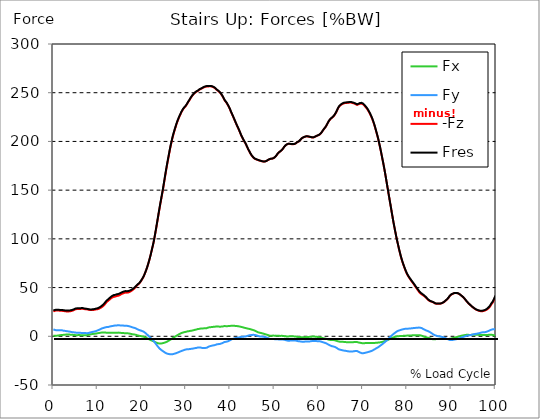
| Category |  Fx |  Fy |  -Fz |  Fres |
|---|---|---|---|---|
| 0.0 | 0.705 | 7.108 | 25.486 | 26.561 |
| 0.167348456675344 | 0.621 | 6.804 | 25.816 | 26.795 |
| 0.334696913350688 | 0.553 | 6.524 | 26.119 | 27.015 |
| 0.5020453700260321 | 0.542 | 6.317 | 26.335 | 27.174 |
| 0.669393826701376 | 0.573 | 6.162 | 26.482 | 27.281 |
| 0.83674228337672 | 0.639 | 6.08 | 26.582 | 27.365 |
| 1.0040907400520642 | 0.742 | 6.082 | 26.562 | 27.353 |
| 1.1621420602454444 | 0.868 | 6.098 | 26.439 | 27.243 |
| 1.3294905169207885 | 1.006 | 6.14 | 26.299 | 27.123 |
| 1.4968389735961325 | 1.133 | 6.156 | 26.194 | 27.028 |
| 1.6641874302714765 | 1.225 | 6.145 | 26.158 | 27.001 |
| 1.8315358869468206 | 1.305 | 6.141 | 26.12 | 26.974 |
| 1.9988843436221646 | 1.37 | 6.098 | 26.083 | 26.94 |
| 2.1662328002975086 | 1.422 | 5.884 | 26.077 | 26.892 |
| 2.333581256972853 | 1.484 | 5.678 | 26.022 | 26.81 |
| 2.5009297136481967 | 1.608 | 5.677 | 25.781 | 26.625 |
| 2.6682781703235405 | 1.688 | 5.535 | 25.633 | 26.49 |
| 2.8356266269988843 | 1.742 | 5.316 | 25.541 | 26.382 |
| 3.002975083674229 | 1.771 | 5.221 | 25.507 | 26.364 |
| 3.1703235403495724 | 1.788 | 5.142 | 25.497 | 26.374 |
| 3.337671997024917 | 1.791 | 5.036 | 25.489 | 26.389 |
| 3.4957233172182973 | 1.777 | 4.952 | 25.53 | 26.446 |
| 3.663071773893641 | 1.725 | 4.779 | 25.594 | 26.524 |
| 3.8304202305689854 | 1.678 | 4.625 | 25.704 | 26.636 |
| 3.997768687244329 | 1.634 | 4.481 | 25.842 | 26.767 |
| 4.165117143919673 | 1.567 | 4.31 | 26.033 | 26.928 |
| 4.332465600595017 | 1.506 | 4.184 | 26.307 | 27.175 |
| 4.499814057270361 | 1.445 | 4.095 | 26.599 | 27.465 |
| 4.667162513945706 | 1.361 | 4.031 | 26.943 | 27.797 |
| 4.834510970621049 | 1.261 | 4.006 | 27.346 | 28.166 |
| 5.001859427296393 | 1.181 | 3.823 | 27.71 | 28.462 |
| 5.169207883971737 | 1.143 | 3.648 | 27.905 | 28.611 |
| 5.336556340647081 | 1.14 | 3.556 | 28 | 28.697 |
| 5.503904797322425 | 1.164 | 3.492 | 28.042 | 28.736 |
| 5.671253253997769 | 1.218 | 3.536 | 28.025 | 28.756 |
| 5.82930457419115 | 1.262 | 3.657 | 27.936 | 28.728 |
| 5.996653030866494 | 1.225 | 3.608 | 27.966 | 28.762 |
| 6.164001487541838 | 1.12 | 3.491 | 28.135 | 28.886 |
| 6.331349944217181 | 1.085 | 3.403 | 28.22 | 28.936 |
| 6.498698400892526 | 1.081 | 3.33 | 28.238 | 28.928 |
| 6.66604685756787 | 1.068 | 3.255 | 28.234 | 28.903 |
| 6.833395314243213 | 1.092 | 3.282 | 28.103 | 28.775 |
| 7.000743770918558 | 1.101 | 3.351 | 27.894 | 28.576 |
| 7.168092227593902 | 1.144 | 3.384 | 27.757 | 28.418 |
| 7.335440684269246 | 1.131 | 3.27 | 27.725 | 28.328 |
| 7.50278914094459 | 1.114 | 3.134 | 27.702 | 28.249 |
| 7.6701375976199335 | 1.218 | 3.18 | 27.573 | 28.106 |
| 7.837486054295278 | 1.349 | 3.271 | 27.419 | 27.949 |
| 7.995537374488658 | 1.518 | 3.421 | 27.226 | 27.766 |
| 8.162885831164003 | 1.741 | 3.706 | 27.055 | 27.605 |
| 8.330234287839346 | 1.922 | 3.916 | 26.971 | 27.545 |
| 8.49758274451469 | 2.072 | 4.104 | 26.966 | 27.568 |
| 8.664931201190035 | 2.209 | 4.296 | 26.982 | 27.605 |
| 8.832279657865378 | 2.334 | 4.474 | 27.007 | 27.655 |
| 8.999628114540721 | 2.441 | 4.633 | 27.051 | 27.733 |
| 9.166976571216066 | 2.57 | 4.846 | 27.126 | 27.847 |
| 9.334325027891412 | 2.647 | 4.992 | 27.25 | 28.006 |
| 9.501673484566755 | 2.731 | 5.178 | 27.419 | 28.214 |
| 9.669021941242098 | 2.817 | 5.374 | 27.62 | 28.452 |
| 9.836370397917442 | 2.961 | 5.688 | 27.716 | 28.614 |
| 10.003718854592787 | 3.132 | 6.035 | 27.77 | 28.727 |
| 10.17106731126813 | 3.229 | 6.293 | 28.043 | 29.05 |
| 10.329118631461512 | 3.362 | 6.622 | 28.345 | 29.419 |
| 10.496467088136853 | 3.504 | 6.983 | 28.708 | 29.86 |
| 10.663815544812199 | 3.642 | 7.359 | 29.126 | 30.365 |
| 10.831164001487544 | 3.765 | 7.76 | 29.59 | 30.926 |
| 10.998512458162887 | 3.871 | 8.134 | 30.078 | 31.5 |
| 11.16586091483823 | 3.899 | 8.44 | 30.596 | 32.068 |
| 11.333209371513574 | 3.834 | 8.536 | 31.319 | 32.775 |
| 11.50055782818892 | 3.828 | 8.766 | 32.128 | 33.619 |
| 11.667906284864264 | 3.84 | 9.07 | 33.02 | 34.562 |
| 11.835254741539607 | 3.782 | 9.275 | 34.008 | 35.562 |
| 12.00260319821495 | 3.706 | 9.407 | 34.891 | 36.44 |
| 12.169951654890292 | 3.593 | 9.345 | 35.527 | 37.035 |
| 12.337300111565641 | 3.57 | 9.458 | 36.249 | 37.76 |
| 12.504648568240984 | 3.561 | 9.634 | 36.896 | 38.421 |
| 12.662699888434362 | 3.649 | 9.901 | 37.497 | 39.076 |
| 12.830048345109708 | 3.695 | 10.092 | 38.134 | 39.747 |
| 12.997396801785053 | 3.727 | 10.274 | 38.803 | 40.444 |
| 13.164745258460396 | 3.742 | 10.451 | 39.379 | 41.036 |
| 13.33209371513574 | 3.707 | 10.56 | 39.872 | 41.538 |
| 13.499442171811083 | 3.676 | 10.672 | 40.355 | 42.03 |
| 13.666790628486426 | 3.706 | 10.807 | 40.567 | 42.274 |
| 13.834139085161771 | 3.719 | 10.956 | 40.655 | 42.406 |
| 14.001487541837117 | 3.725 | 11.151 | 40.742 | 42.554 |
| 14.16883599851246 | 3.696 | 11.14 | 41.029 | 42.815 |
| 14.336184455187803 | 3.704 | 11.167 | 41.333 | 43.103 |
| 14.503532911863147 | 3.741 | 11.233 | 41.492 | 43.268 |
| 14.670881368538492 | 3.766 | 11.284 | 41.617 | 43.398 |
| 14.828932688731873 | 3.736 | 11.28 | 41.849 | 43.612 |
| 14.996281145407215 | 3.639 | 11.196 | 42.248 | 43.965 |
| 15.163629602082558 | 3.534 | 11.117 | 42.732 | 44.405 |
| 15.330978058757903 | 3.438 | 11.057 | 43.223 | 44.855 |
| 15.498326515433247 | 3.418 | 11.064 | 43.575 | 45.196 |
| 15.665674972108594 | 3.379 | 11.024 | 43.872 | 45.492 |
| 15.833023428783937 | 3.256 | 10.89 | 44.227 | 45.819 |
| 16.00037188545928 | 3.229 | 10.901 | 44.474 | 46.064 |
| 16.167720342134626 | 3.178 | 10.856 | 44.78 | 46.343 |
| 16.335068798809967 | 3.136 | 10.777 | 44.867 | 46.398 |
| 16.502417255485312 | 3.177 | 10.824 | 44.717 | 46.27 |
| 16.669765712160658 | 3.119 | 10.73 | 44.774 | 46.294 |
| 16.837114168836 | 3.049 | 10.623 | 44.854 | 46.333 |
| 17.004462625511344 | 2.947 | 10.476 | 45.051 | 46.478 |
| 17.16251394570472 | 2.807 | 10.281 | 45.384 | 46.743 |
| 17.32986240238007 | 2.66 | 10.065 | 45.755 | 47.041 |
| 17.497210859055414 | 2.482 | 9.784 | 46.204 | 47.399 |
| 17.664559315730756 | 2.304 | 9.497 | 46.693 | 47.798 |
| 17.8319077724061 | 2.132 | 9.209 | 47.245 | 48.267 |
| 17.999256229081443 | 2.021 | 8.998 | 47.758 | 48.721 |
| 18.166604685756788 | 1.923 | 8.822 | 48.373 | 49.291 |
| 18.333953142432133 | 1.825 | 8.634 | 49.122 | 49.997 |
| 18.501301599107478 | 1.658 | 8.361 | 49.981 | 50.799 |
| 18.668650055782823 | 1.5 | 8.042 | 50.856 | 51.602 |
| 18.835998512458165 | 1.249 | 7.628 | 51.719 | 52.369 |
| 19.00334696913351 | 0.989 | 7.2 | 52.554 | 53.114 |
| 19.170695425808855 | 0.769 | 6.838 | 53.224 | 53.722 |
| 19.338043882484197 | 0.578 | 6.552 | 53.789 | 54.24 |
| 19.496095202677576 | 0.449 | 6.303 | 54.597 | 55.016 |
| 19.66344365935292 | 0.312 | 6.044 | 55.618 | 56.002 |
| 19.830792116028263 | 0.185 | 5.79 | 56.783 | 57.135 |
| 19.998140572703612 | 0.049 | 5.527 | 58.024 | 58.348 |
| 20.165489029378953 | -0.103 | 5.251 | 59.298 | 59.596 |
| 20.3328374860543 | -0.294 | 4.909 | 60.615 | 60.877 |
| 20.500185942729644 | -0.562 | 4.441 | 62.273 | 62.494 |
| 20.667534399404985 | -0.87 | 3.909 | 64.105 | 64.29 |
| 20.83488285608033 | -1.204 | 3.331 | 66.044 | 66.197 |
| 21.002231312755672 | -1.59 | 2.672 | 68.091 | 68.216 |
| 21.16957976943102 | -2.004 | 1.942 | 70.241 | 70.346 |
| 21.336928226106362 | -2.41 | 1.197 | 72.622 | 72.723 |
| 21.504276682781704 | -2.807 | 0.466 | 75.151 | 75.257 |
| 21.67162513945705 | -3.204 | -0.262 | 77.777 | 77.9 |
| 21.82967645965043 | -3.572 | -0.969 | 80.565 | 80.71 |
| 21.997024916325774 | -3.902 | -1.675 | 83.576 | 83.744 |
| 22.16437337300112 | -4.218 | -2.37 | 86.722 | 86.92 |
| 22.33172182967646 | -4.526 | -3.091 | 89.991 | 90.219 |
| 22.499070286351806 | -4.858 | -3.914 | 93.144 | 93.4 |
| 22.666418743027148 | -5.206 | -4.799 | 96.469 | 96.766 |
| 22.833767199702496 | -5.574 | -5.767 | 100.356 | 100.712 |
| 23.00111565637784 | -5.958 | -6.775 | 104.448 | 104.872 |
| 23.168464113053183 | -6.32 | -7.785 | 108.735 | 109.231 |
| 23.335812569728528 | -6.617 | -8.771 | 113.099 | 113.661 |
| 23.50316102640387 | -6.906 | -9.774 | 117.557 | 118.189 |
| 23.670509483079215 | -7.169 | -10.757 | 122.031 | 122.732 |
| 23.83785793975456 | -7.397 | -11.697 | 126.544 | 127.312 |
| 23.995909259947936 | -7.474 | -12.486 | 130.902 | 131.721 |
| 24.163257716623285 | -7.526 | -13.21 | 135.264 | 136.127 |
| 24.330606173298627 | -7.429 | -13.806 | 139.342 | 140.233 |
| 24.49795462997397 | -7.277 | -14.379 | 143.58 | 144.494 |
| 24.665303086649313 | -7.133 | -14.914 | 147.705 | 148.639 |
| 24.83265154332466 | -6.949 | -15.418 | 152.032 | 152.981 |
| 25.0 | -6.717 | -15.948 | 156.606 | 157.573 |
| 25.167348456675345 | -6.5 | -16.47 | 161.262 | 162.245 |
| 25.334696913350694 | -6.255 | -16.955 | 165.877 | 166.873 |
| 25.502045370026035 | -5.994 | -17.391 | 170.374 | 171.378 |
| 25.669393826701377 | -5.652 | -17.757 | 174.746 | 175.754 |
| 25.836742283376722 | -5.188 | -17.958 | 178.879 | 179.873 |
| 26.004090740052067 | -4.683 | -18.101 | 182.936 | 183.91 |
| 26.17143919672741 | -4.234 | -18.251 | 186.958 | 187.917 |
| 26.329490516920792 | -3.833 | -18.425 | 191.001 | 191.948 |
| 26.49683897359613 | -3.38 | -18.504 | 194.798 | 195.727 |
| 26.66418743027148 | -2.883 | -18.475 | 198.248 | 199.151 |
| 26.831535886946828 | -2.365 | -18.423 | 201.605 | 202.48 |
| 26.998884343622166 | -1.862 | -18.331 | 204.745 | 205.593 |
| 27.166232800297514 | -1.383 | -18.169 | 207.548 | 208.371 |
| 27.333581256972852 | -0.884 | -17.943 | 210.185 | 210.977 |
| 27.5009297136482 | -0.385 | -17.706 | 212.67 | 213.434 |
| 27.668278170323543 | 0.088 | -17.47 | 215.14 | 215.879 |
| 27.835626626998888 | 0.544 | -17.191 | 217.551 | 218.263 |
| 28.002975083674233 | 1.005 | -16.893 | 219.759 | 220.443 |
| 28.170323540349575 | 1.456 | -16.582 | 221.798 | 222.455 |
| 28.33767199702492 | 1.91 | -16.264 | 223.707 | 224.339 |
| 28.50502045370026 | 2.325 | -15.953 | 225.482 | 226.088 |
| 28.663071773893645 | 2.678 | -15.657 | 227.109 | 227.694 |
| 28.830420230568986 | 3.057 | -15.335 | 228.783 | 229.343 |
| 28.99776868724433 | 3.38 | -15.042 | 230.334 | 230.874 |
| 29.165117143919673 | 3.627 | -14.777 | 231.701 | 232.225 |
| 29.33246560059502 | 3.891 | -14.49 | 232.964 | 233.471 |
| 29.499814057270367 | 4.146 | -14.203 | 234.045 | 234.538 |
| 29.66716251394571 | 4.328 | -13.915 | 234.818 | 235.299 |
| 29.834510970621054 | 4.486 | -13.68 | 235.706 | 236.175 |
| 30.00185942729639 | 4.626 | -13.506 | 236.748 | 237.204 |
| 30.169207883971744 | 4.961 | -13.216 | 237.904 | 238.343 |
| 30.33655634064708 | 5.057 | -13.245 | 239.181 | 239.619 |
| 30.50390479732243 | 5.129 | -13.274 | 240.473 | 240.908 |
| 30.671253253997772 | 5.246 | -13.21 | 241.707 | 242.138 |
| 30.829304574191156 | 5.451 | -13.038 | 242.839 | 243.26 |
| 30.996653030866494 | 5.571 | -12.96 | 244.154 | 244.571 |
| 31.164001487541842 | 5.677 | -12.93 | 245.36 | 245.775 |
| 31.331349944217187 | 5.801 | -12.819 | 246.468 | 246.877 |
| 31.498698400892525 | 5.958 | -12.689 | 247.475 | 247.88 |
| 31.666046857567874 | 6.172 | -12.53 | 248.296 | 248.697 |
| 31.833395314243212 | 6.396 | -12.369 | 249.077 | 249.474 |
| 32.00074377091856 | 6.617 | -12.212 | 249.841 | 250.233 |
| 32.1680922275939 | 6.783 | -12.07 | 250.457 | 250.847 |
| 32.33544068426925 | 6.928 | -11.943 | 250.994 | 251.38 |
| 32.50278914094459 | 7.158 | -11.771 | 251.401 | 251.786 |
| 32.670137597619934 | 7.459 | -11.542 | 251.785 | 252.169 |
| 32.83748605429528 | 7.52 | -11.588 | 252.478 | 252.864 |
| 33.004834510970625 | 7.628 | -11.6 | 253.034 | 253.422 |
| 33.162885831164004 | 7.789 | -11.559 | 253.452 | 253.842 |
| 33.33023428783935 | 7.929 | -11.588 | 253.823 | 254.219 |
| 33.497582744514695 | 8.02 | -11.783 | 254.114 | 254.521 |
| 33.664931201190036 | 8.029 | -12.006 | 254.572 | 254.991 |
| 33.83227965786538 | 8.052 | -12.124 | 255.065 | 255.49 |
| 33.99962811454073 | 8.13 | -12.07 | 255.452 | 255.878 |
| 34.16697657121607 | 8.21 | -12.005 | 255.76 | 256.185 |
| 34.33432502789141 | 8.32 | -11.912 | 256.034 | 256.458 |
| 34.50167348456676 | 8.351 | -11.877 | 256.229 | 256.654 |
| 34.6690219412421 | 8.339 | -11.867 | 256.406 | 256.833 |
| 34.83637039791744 | 8.573 | -11.51 | 256.436 | 256.86 |
| 35.00371885459279 | 8.951 | -10.869 | 256.391 | 256.811 |
| 35.17106731126814 | 9.144 | -10.526 | 256.501 | 256.922 |
| 35.338415767943474 | 9.285 | -10.236 | 256.583 | 257.003 |
| 35.49646708813686 | 9.344 | -10.068 | 256.547 | 256.965 |
| 35.6638155448122 | 9.411 | -9.849 | 256.476 | 256.89 |
| 35.831164001487544 | 9.535 | -9.615 | 256.308 | 256.718 |
| 35.998512458162885 | 9.605 | -9.477 | 256.078 | 256.485 |
| 36.165860914838234 | 9.675 | -9.364 | 255.794 | 256.2 |
| 36.333209371513576 | 9.742 | -9.222 | 255.32 | 255.729 |
| 36.50055782818892 | 9.825 | -9.03 | 254.77 | 255.177 |
| 36.667906284864266 | 9.941 | -8.783 | 254.184 | 254.59 |
| 36.83525474153961 | 10.082 | -8.448 | 253.466 | 253.87 |
| 37.002603198214956 | 10.188 | -8.177 | 252.697 | 253.097 |
| 37.1699516548903 | 10.143 | -8.067 | 252.071 | 252.465 |
| 37.337300111565646 | 9.982 | -8.038 | 251.561 | 251.95 |
| 37.50464856824098 | 9.826 | -8.004 | 251.043 | 251.424 |
| 37.66269988843437 | 9.824 | -7.852 | 250.206 | 250.584 |
| 37.83004834510971 | 9.879 | -7.63 | 249.205 | 249.579 |
| 37.99739680178505 | 9.965 | -7.374 | 248.092 | 248.462 |
| 38.16474525846039 | 10.029 | -7.156 | 246.943 | 247.314 |
| 38.33209371513574 | 10.123 | -6.771 | 245.678 | 246.047 |
| 38.49944217181109 | 10.324 | -6.291 | 244.165 | 244.532 |
| 38.666790628486424 | 10.473 | -5.917 | 242.675 | 243.044 |
| 38.83413908516178 | 10.469 | -5.76 | 241.517 | 241.881 |
| 39.001487541837115 | 10.408 | -5.692 | 240.546 | 240.906 |
| 39.16883599851246 | 10.38 | -5.609 | 239.564 | 239.922 |
| 39.336184455187805 | 10.388 | -5.334 | 238.28 | 238.633 |
| 39.503532911863154 | 10.46 | -5.048 | 236.893 | 237.247 |
| 39.670881368538495 | 10.517 | -4.768 | 235.553 | 235.904 |
| 39.83822982521384 | 10.578 | -4.357 | 233.94 | 234.29 |
| 39.996281145407224 | 10.672 | -3.921 | 232.204 | 232.556 |
| 40.163629602082565 | 10.743 | -3.385 | 230.251 | 230.607 |
| 40.33097805875791 | 10.738 | -3.081 | 228.547 | 228.904 |
| 40.498326515433256 | 10.753 | -2.781 | 226.885 | 227.239 |
| 40.6656749721086 | 10.756 | -2.523 | 225.177 | 225.526 |
| 40.83302342878393 | 10.75 | -2.257 | 223.41 | 223.758 |
| 41.00037188545929 | 10.701 | -2.04 | 221.648 | 221.993 |
| 41.16772034213463 | 10.624 | -1.871 | 219.814 | 220.155 |
| 41.33506879880997 | 10.561 | -1.721 | 218.05 | 218.389 |
| 41.50241725548531 | 10.508 | -1.518 | 216.341 | 216.677 |
| 41.66976571216066 | 10.388 | -1.375 | 214.722 | 215.053 |
| 41.837114168836 | 10.248 | -1.256 | 213.091 | 213.416 |
| 42.004462625511344 | 10.117 | -1.127 | 211.399 | 211.718 |
| 42.17181108218669 | 9.965 | -0.952 | 209.565 | 209.878 |
| 42.32986240238007 | 9.798 | -0.77 | 207.706 | 208.014 |
| 42.497210859055414 | 9.622 | -0.617 | 205.827 | 206.128 |
| 42.66455931573076 | 9.42 | -0.489 | 204.299 | 204.595 |
| 42.831907772406105 | 9.202 | -0.453 | 202.933 | 203.225 |
| 42.999256229081446 | 8.996 | -0.408 | 201.466 | 201.754 |
| 43.16660468575679 | 8.785 | -0.309 | 200.017 | 200.301 |
| 43.33395314243214 | 8.562 | -0.221 | 198.753 | 199.036 |
| 43.50130159910748 | 8.36 | -0.089 | 197.399 | 197.679 |
| 43.66865005578282 | 8.199 | 0.146 | 195.715 | 195.993 |
| 43.83599851245817 | 8.032 | 0.395 | 194.029 | 194.305 |
| 44.00334696913351 | 7.856 | 0.616 | 192.398 | 192.67 |
| 44.17069542580886 | 7.69 | 0.849 | 190.903 | 191.171 |
| 44.3380438824842 | 7.512 | 0.992 | 189.451 | 189.714 |
| 44.49609520267758 | 7.334 | 1.132 | 188 | 188.257 |
| 44.66344365935292 | 7.112 | 1.251 | 186.771 | 187.022 |
| 44.83079211602827 | 6.886 | 1.368 | 185.558 | 185.804 |
| 44.99814057270361 | 6.639 | 1.443 | 184.562 | 184.806 |
| 45.16548902937895 | 6.398 | 1.472 | 183.691 | 183.929 |
| 45.332837486054295 | 6.167 | 1.465 | 182.921 | 183.153 |
| 45.500185942729644 | 5.893 | 1.407 | 182.325 | 182.55 |
| 45.66753439940499 | 5.518 | 1.22 | 181.943 | 182.153 |
| 45.83488285608033 | 5.143 | 1.008 | 181.628 | 181.825 |
| 46.00223131275568 | 4.766 | 0.759 | 181.361 | 181.543 |
| 46.16957976943102 | 4.398 | 0.51 | 181.081 | 181.249 |
| 46.336928226106366 | 4.044 | 0.234 | 180.785 | 180.94 |
| 46.50427668278171 | 3.803 | 0.028 | 180.539 | 180.686 |
| 46.671625139457056 | 3.641 | -0.107 | 180.349 | 180.495 |
| 46.829676459650436 | 3.49 | -0.141 | 180.064 | 180.202 |
| 46.99702491632577 | 3.317 | -0.191 | 179.812 | 179.945 |
| 47.16437337300112 | 3.115 | -0.28 | 179.621 | 179.749 |
| 47.33172182967646 | 2.911 | -0.371 | 179.431 | 179.555 |
| 47.49907028635181 | 2.674 | -0.504 | 179.333 | 179.456 |
| 47.66641874302716 | 2.438 | -0.638 | 179.236 | 179.357 |
| 47.83376719970249 | 2.227 | -0.742 | 179.373 | 179.49 |
| 48.001115656377834 | 2.018 | -0.846 | 179.51 | 179.621 |
| 48.16846411305319 | 1.773 | -1.093 | 179.861 | 179.97 |
| 48.33581256972853 | 1.506 | -1.434 | 180.354 | 180.46 |
| 48.50316102640387 | 1.239 | -1.776 | 180.848 | 180.952 |
| 48.67050948307921 | 0.972 | -2.118 | 181.34 | 181.443 |
| 48.837857939754564 | 0.75 | -2.514 | 181.655 | 181.759 |
| 49.005206396429905 | 0.528 | -2.908 | 181.97 | 182.075 |
| 49.163257716623285 | 0.501 | -3.022 | 182.177 | 182.284 |
| 49.33060617329863 | 0.601 | -2.885 | 182.228 | 182.332 |
| 49.49795462997397 | 0.699 | -2.73 | 182.327 | 182.43 |
| 49.66530308664932 | 0.706 | -2.728 | 182.585 | 182.689 |
| 49.832651543324666 | 0.652 | -2.842 | 182.934 | 183.036 |
| 50.0 | 0.648 | -2.925 | 183.496 | 183.599 |
| 50.16734845667534 | 0.671 | -2.993 | 184.171 | 184.275 |
| 50.33469691335069 | 0.678 | -3.021 | 184.954 | 185.058 |
| 50.50204537002604 | 0.643 | -3.041 | 185.878 | 185.981 |
| 50.66939382670139 | 0.467 | -3.123 | 187.117 | 187.221 |
| 50.836742283376715 | 0.411 | -3.178 | 188.023 | 188.129 |
| 51.00409074005207 | 0.439 | -3.2 | 188.738 | 188.843 |
| 51.17143919672741 | 0.41 | -3.209 | 189.332 | 189.434 |
| 51.32949051692079 | 0.4 | -3.209 | 189.914 | 190.012 |
| 51.496838973596134 | 0.442 | -3.188 | 190.488 | 190.584 |
| 51.66418743027148 | 0.481 | -3.178 | 191.188 | 191.285 |
| 51.831535886946824 | 0.461 | -3.214 | 192.08 | 192.18 |
| 51.99888434362217 | 0.295 | -3.372 | 193.018 | 193.117 |
| 52.16623280029752 | 0.16 | -3.526 | 194.271 | 194.373 |
| 52.33358125697285 | 0.055 | -3.665 | 195.275 | 195.376 |
| 52.5009297136482 | -0.035 | -3.884 | 195.94 | 196.041 |
| 52.668278170323546 | -0.118 | -4.107 | 196.493 | 196.597 |
| 52.835626626998895 | -0.202 | -4.34 | 197.003 | 197.11 |
| 53.00297508367424 | -0.215 | -4.508 | 197.367 | 197.471 |
| 53.17032354034958 | -0.146 | -4.572 | 197.622 | 197.723 |
| 53.33767199702492 | -0.024 | -4.527 | 197.573 | 197.674 |
| 53.50502045370027 | 0.066 | -4.418 | 197.465 | 197.562 |
| 53.663071773893655 | 0.039 | -4.357 | 197.336 | 197.432 |
| 53.83042023056899 | 0.011 | -4.298 | 197.209 | 197.302 |
| 53.99776868724433 | -0.019 | -4.255 | 197.144 | 197.234 |
| 54.16511714391967 | -0.053 | -4.231 | 197.146 | 197.236 |
| 54.33246560059503 | -0.088 | -4.208 | 197.149 | 197.241 |
| 54.49981405727037 | -0.1 | -4.254 | 197.32 | 197.409 |
| 54.667162513945705 | -0.125 | -4.31 | 197.523 | 197.61 |
| 54.834510970621054 | -0.285 | -4.479 | 198.065 | 198.154 |
| 55.0018594272964 | -0.458 | -4.654 | 198.752 | 198.848 |
| 55.169207883971744 | -0.68 | -4.891 | 199.31 | 199.409 |
| 55.336556340647086 | -0.738 | -5.007 | 199.679 | 199.779 |
| 55.50390479732243 | -0.719 | -5.049 | 199.97 | 200.071 |
| 55.671253253997776 | -0.756 | -5.17 | 200.654 | 200.757 |
| 55.83860171067312 | -0.855 | -5.341 | 201.524 | 201.63 |
| 55.9966530308665 | -0.911 | -5.46 | 202.474 | 202.583 |
| 56.16400148754184 | -0.926 | -5.502 | 203.125 | 203.238 |
| 56.33134994421718 | -0.948 | -5.547 | 203.716 | 203.831 |
| 56.498698400892536 | -0.965 | -5.534 | 204.112 | 204.227 |
| 56.66604685756788 | -0.981 | -5.522 | 204.508 | 204.623 |
| 56.83339531424321 | -0.934 | -5.465 | 204.718 | 204.828 |
| 57.00074377091856 | -0.87 | -5.428 | 204.875 | 204.98 |
| 57.16809222759391 | -0.759 | -5.379 | 205.216 | 205.317 |
| 57.33544068426925 | -0.716 | -5.457 | 205.24 | 205.342 |
| 57.5027891409446 | -0.758 | -5.507 | 205.166 | 205.269 |
| 57.670137597619934 | -0.702 | -5.471 | 205.091 | 205.191 |
| 57.83748605429528 | -0.608 | -5.364 | 204.832 | 204.927 |
| 58.004834510970625 | -0.532 | -5.243 | 204.62 | 204.71 |
| 58.16288583116401 | -0.464 | -5.082 | 204.507 | 204.598 |
| 58.330234287839346 | -0.432 | -4.993 | 204.261 | 204.349 |
| 58.497582744514695 | -0.352 | -4.875 | 204.095 | 204.179 |
| 58.66493120119004 | -0.243 | -4.752 | 203.958 | 204.039 |
| 58.832279657865385 | -0.266 | -4.784 | 204.149 | 204.23 |
| 58.999628114540734 | -0.297 | -4.811 | 204.529 | 204.611 |
| 59.16697657121607 | -0.356 | -4.862 | 204.801 | 204.884 |
| 59.33432502789142 | -0.447 | -4.902 | 205.082 | 205.166 |
| 59.50167348456676 | -0.546 | -4.945 | 205.607 | 205.691 |
| 59.66902194124211 | -0.643 | -4.996 | 206.023 | 206.106 |
| 59.83637039791745 | -0.743 | -5.033 | 206.252 | 206.338 |
| 60.00371885459278 | -0.84 | -5.103 | 206.547 | 206.634 |
| 60.17106731126813 | -0.861 | -5.134 | 206.998 | 207.085 |
| 60.33841576794349 | -0.986 | -5.231 | 207.56 | 207.652 |
| 60.49646708813685 | -1.204 | -5.359 | 208.377 | 208.473 |
| 60.6638155448122 | -1.496 | -5.639 | 209.406 | 209.512 |
| 60.831164001487544 | -1.764 | -5.886 | 210.439 | 210.555 |
| 60.99851245816289 | -1.965 | -6.217 | 211.565 | 211.694 |
| 61.16586091483824 | -2.126 | -6.468 | 212.661 | 212.801 |
| 61.333209371513576 | -2.207 | -6.619 | 213.518 | 213.665 |
| 61.50055782818892 | -2.379 | -6.891 | 214.476 | 214.633 |
| 61.667906284864266 | -2.59 | -7.225 | 215.684 | 215.856 |
| 61.835254741539615 | -2.825 | -7.609 | 217.006 | 217.195 |
| 62.002603198214956 | -3.088 | -8.024 | 218.461 | 218.662 |
| 62.16995165489029 | -3.349 | -8.438 | 219.909 | 220.125 |
| 62.33730011156564 | -3.521 | -8.795 | 221.132 | 221.361 |
| 62.504648568240995 | -3.692 | -9.199 | 222.124 | 222.372 |
| 62.67199702491633 | -3.864 | -9.629 | 223.002 | 223.271 |
| 62.83004834510971 | -3.975 | -9.973 | 223.825 | 224.109 |
| 62.99739680178505 | -3.895 | -10.184 | 224.273 | 224.567 |
| 63.1647452584604 | -3.899 | -10.369 | 224.957 | 225.258 |
| 63.33209371513575 | -3.869 | -10.479 | 225.638 | 225.943 |
| 63.4994421718111 | -3.954 | -10.676 | 226.587 | 226.903 |
| 63.666790628486424 | -4.105 | -10.942 | 227.681 | 228.012 |
| 63.83413908516177 | -4.322 | -11.29 | 228.974 | 229.323 |
| 64.00148754183712 | -4.603 | -11.784 | 230.34 | 230.712 |
| 64.16883599851248 | -4.872 | -12.294 | 231.948 | 232.35 |
| 64.3361844551878 | -5.138 | -12.799 | 233.573 | 234.003 |
| 64.50353291186315 | -5.355 | -13.247 | 234.971 | 235.43 |
| 64.6708813685385 | -5.491 | -13.584 | 236.042 | 236.524 |
| 64.83822982521384 | -5.557 | -13.785 | 236.794 | 237.291 |
| 65.00557828188919 | -5.616 | -13.955 | 237.418 | 237.926 |
| 65.16362960208257 | -5.656 | -14.159 | 238.005 | 238.526 |
| 65.3309780587579 | -5.679 | -14.322 | 238.375 | 238.907 |
| 65.49832651543326 | -5.702 | -14.493 | 238.852 | 239.394 |
| 65.6656749721086 | -5.754 | -14.651 | 239.121 | 239.674 |
| 65.83302342878395 | -5.818 | -14.754 | 239.25 | 239.81 |
| 66.00037188545929 | -5.883 | -14.851 | 239.364 | 239.932 |
| 66.16772034213463 | -5.994 | -15.012 | 239.454 | 240.036 |
| 66.33506879880998 | -6.089 | -15.173 | 239.53 | 240.126 |
| 66.50241725548531 | -6.153 | -15.333 | 239.584 | 240.192 |
| 66.66976571216065 | -6.188 | -15.448 | 239.67 | 240.285 |
| 66.83711416883601 | -6.192 | -15.518 | 239.786 | 240.406 |
| 67.00446262551135 | -6.208 | -15.582 | 239.869 | 240.492 |
| 67.1718110821867 | -6.233 | -15.645 | 239.931 | 240.557 |
| 67.32986240238007 | -6.249 | -15.684 | 239.831 | 240.459 |
| 67.49721085905541 | -6.247 | -15.694 | 239.598 | 240.228 |
| 67.66455931573076 | -6.134 | -15.596 | 239.419 | 240.04 |
| 67.83190777240611 | -6.057 | -15.582 | 239.526 | 240.144 |
| 67.99925622908145 | -5.916 | -15.321 | 238.973 | 239.573 |
| 68.16660468575678 | -5.807 | -15.099 | 238.398 | 238.984 |
| 68.33395314243214 | -5.828 | -15.085 | 238.278 | 238.865 |
| 68.50130159910749 | -5.852 | -15.065 | 237.954 | 238.54 |
| 68.66865005578282 | -5.898 | -15.07 | 237.521 | 238.108 |
| 68.83599851245816 | -6.157 | -15.425 | 237.616 | 238.229 |
| 69.00334696913352 | -6.352 | -15.861 | 238.065 | 238.714 |
| 69.17069542580886 | -6.506 | -16.276 | 238.502 | 239.184 |
| 69.3380438824842 | -6.602 | -16.596 | 238.704 | 239.414 |
| 69.50539233915956 | -6.779 | -16.948 | 238.812 | 239.559 |
| 69.66344365935292 | -6.969 | -17.262 | 238.829 | 239.611 |
| 69.83079211602826 | -7.112 | -17.431 | 238.602 | 239.404 |
| 69.99814057270362 | -7.192 | -17.452 | 238.149 | 238.954 |
| 70.16548902937896 | -7.125 | -17.302 | 237.446 | 238.24 |
| 70.33283748605429 | -7.068 | -17.134 | 236.674 | 237.453 |
| 70.50018594272964 | -6.962 | -16.916 | 235.839 | 236.599 |
| 70.667534399405 | -6.93 | -16.746 | 234.973 | 235.721 |
| 70.83488285608033 | -6.898 | -16.575 | 234.107 | 234.842 |
| 71.00223131275568 | -6.858 | -16.37 | 232.996 | 233.715 |
| 71.16957976943102 | -6.834 | -16.172 | 231.755 | 232.459 |
| 71.33692822610637 | -6.825 | -15.965 | 230.423 | 231.112 |
| 71.50427668278171 | -6.83 | -15.746 | 229.021 | 229.697 |
| 71.67162513945706 | -6.86 | -15.475 | 227.538 | 228.196 |
| 71.8389735961324 | -6.937 | -15.241 | 225.904 | 226.548 |
| 71.99702491632577 | -6.984 | -14.948 | 224.152 | 224.779 |
| 72.16437337300113 | -6.973 | -14.561 | 222.251 | 222.853 |
| 72.33172182967647 | -6.929 | -14.135 | 220.136 | 220.712 |
| 72.49907028635181 | -6.906 | -13.743 | 217.883 | 218.439 |
| 72.66641874302715 | -6.831 | -13.296 | 215.44 | 215.971 |
| 72.8337671997025 | -6.727 | -12.811 | 212.778 | 213.282 |
| 73.00111565637783 | -6.618 | -12.327 | 210.04 | 210.516 |
| 73.16846411305319 | -6.56 | -11.905 | 207.282 | 207.736 |
| 73.33581256972853 | -6.528 | -11.484 | 204.42 | 204.854 |
| 73.50316102640387 | -6.467 | -11.015 | 201.358 | 201.772 |
| 73.67050948307921 | -6.369 | -10.475 | 198.042 | 198.43 |
| 73.83785793975457 | -6.271 | -9.94 | 194.621 | 194.984 |
| 74.00520639642991 | -6.148 | -9.388 | 191.029 | 191.368 |
| 74.16325771662328 | -5.997 | -8.8 | 187.296 | 187.607 |
| 74.33060617329863 | -5.825 | -8.217 | 183.521 | 183.806 |
| 74.49795462997398 | -5.607 | -7.649 | 179.692 | 179.95 |
| 74.66530308664932 | -5.367 | -7.059 | 175.766 | 175.998 |
| 74.83265154332466 | -5.104 | -6.424 | 171.756 | 171.961 |
| 75.00000000000001 | -4.82 | -5.74 | 167.552 | 167.728 |
| 75.16734845667534 | -4.55 | -5.073 | 163.17 | 163.322 |
| 75.3346969133507 | -4.274 | -4.39 | 158.653 | 158.785 |
| 75.50204537002605 | -4.003 | -3.722 | 154.167 | 154.281 |
| 75.66939382670138 | -3.677 | -2.958 | 149.718 | 149.809 |
| 75.83674228337672 | -3.301 | -2.138 | 145.211 | 145.292 |
| 76.00409074005208 | -2.948 | -1.379 | 140.812 | 140.879 |
| 76.17143919672742 | -2.579 | -0.668 | 136.455 | 136.51 |
| 76.33878765340276 | -2.195 | 0.036 | 132.043 | 132.089 |
| 76.49683897359614 | -1.841 | 0.757 | 127.523 | 127.57 |
| 76.66418743027148 | -1.506 | 1.441 | 123.096 | 123.149 |
| 76.83153588694682 | -1.182 | 2.11 | 118.722 | 118.782 |
| 76.99888434362218 | -0.904 | 2.726 | 114.576 | 114.648 |
| 77.16623280029752 | -0.677 | 3.314 | 110.68 | 110.774 |
| 77.33358125697285 | -0.456 | 3.888 | 106.835 | 106.952 |
| 77.5009297136482 | -0.235 | 4.426 | 102.959 | 103.101 |
| 77.66827817032356 | -0.068 | 4.912 | 99.324 | 99.494 |
| 77.83562662699889 | 0.028 | 5.315 | 95.899 | 96.098 |
| 78.00297508367423 | 0.102 | 5.691 | 92.531 | 92.76 |
| 78.17032354034959 | 0.172 | 6.017 | 89.193 | 89.45 |
| 78.33767199702493 | 0.206 | 6.24 | 86.038 | 86.317 |
| 78.50502045370027 | 0.239 | 6.448 | 83.106 | 83.406 |
| 78.67236891037561 | 0.276 | 6.689 | 80.298 | 80.628 |
| 78.83042023056899 | 0.328 | 6.947 | 77.707 | 78.071 |
| 78.99776868724433 | 0.38 | 7.153 | 75.293 | 75.691 |
| 79.16511714391969 | 0.483 | 7.35 | 73.092 | 73.521 |
| 79.33246560059503 | 0.575 | 7.531 | 70.936 | 71.395 |
| 79.49981405727036 | 0.628 | 7.637 | 68.911 | 69.392 |
| 79.66716251394571 | 0.656 | 7.715 | 66.958 | 67.459 |
| 79.83451097062107 | 0.694 | 7.792 | 65.177 | 65.696 |
| 80.00185942729641 | 0.69 | 7.793 | 63.599 | 64.129 |
| 80.16920788397174 | 0.716 | 7.827 | 62.159 | 62.704 |
| 80.33655634064709 | 0.742 | 7.868 | 60.878 | 61.443 |
| 80.50390479732243 | 0.76 | 7.899 | 59.725 | 60.308 |
| 80.67125325399778 | 0.803 | 7.969 | 58.651 | 59.255 |
| 80.83860171067312 | 0.864 | 8.074 | 57.529 | 58.157 |
| 80.99665303086651 | 0.923 | 8.193 | 56.422 | 57.08 |
| 81.16400148754184 | 0.955 | 8.284 | 55.422 | 56.112 |
| 81.3313499442172 | 0.981 | 8.372 | 54.441 | 55.164 |
| 81.49869840089255 | 1.041 | 8.44 | 53.336 | 54.084 |
| 81.66604685756786 | 1.086 | 8.505 | 52.199 | 52.975 |
| 81.83339531424322 | 1.135 | 8.616 | 51.076 | 51.89 |
| 82.00074377091858 | 1.164 | 8.7 | 49.991 | 50.833 |
| 82.16809222759392 | 1.178 | 8.764 | 48.923 | 49.788 |
| 82.33544068426926 | 1.167 | 8.804 | 47.864 | 48.749 |
| 82.50278914094459 | 1.147 | 8.871 | 46.81 | 47.721 |
| 82.67013759761994 | 1.175 | 8.938 | 45.661 | 46.597 |
| 82.83748605429528 | 1.032 | 8.799 | 44.77 | 45.688 |
| 83.00483451097062 | 0.932 | 8.777 | 43.991 | 44.907 |
| 83.17218296764597 | 0.76 | 8.621 | 43.389 | 44.28 |
| 83.33023428783935 | 0.526 | 8.342 | 42.854 | 43.698 |
| 83.4975827445147 | 0.219 | 7.902 | 42.384 | 43.155 |
| 83.66493120119004 | -0.109 | 7.39 | 41.915 | 42.604 |
| 83.83227965786537 | -0.406 | 7.035 | 41.312 | 41.95 |
| 83.99962811454073 | -0.703 | 6.67 | 40.703 | 41.301 |
| 84.16697657121607 | -1.009 | 6.264 | 40.115 | 40.673 |
| 84.33432502789142 | -1.208 | 5.927 | 39.357 | 39.889 |
| 84.50167348456677 | -1.329 | 5.669 | 38.474 | 38.983 |
| 84.6690219412421 | -1.439 | 5.361 | 37.648 | 38.133 |
| 84.83637039791745 | -1.586 | 5.023 | 36.977 | 37.435 |
| 85.0037188545928 | -1.776 | 4.643 | 36.468 | 36.889 |
| 85.17106731126813 | -2.01 | 4.228 | 36.036 | 36.411 |
| 85.33841576794349 | -2.294 | 3.75 | 35.761 | 36.096 |
| 85.50576422461883 | -2.611 | 3.222 | 35.528 | 35.832 |
| 85.66381554481221 | -2.907 | 2.692 | 35.268 | 35.544 |
| 85.83116400148755 | -3.05 | 2.156 | 34.94 | 35.199 |
| 85.99851245816289 | -3.081 | 1.678 | 34.546 | 34.805 |
| 86.16586091483823 | -3.038 | 1.325 | 34.12 | 34.378 |
| 86.33320937151358 | -2.982 | 0.997 | 33.716 | 33.97 |
| 86.50055782818893 | -2.858 | 0.815 | 33.436 | 33.677 |
| 86.66790628486427 | -2.86 | 0.509 | 33.322 | 33.555 |
| 86.83525474153961 | -2.853 | 0.184 | 33.306 | 33.534 |
| 87.00260319821496 | -2.782 | -0.039 | 33.311 | 33.539 |
| 87.16995165489031 | -2.631 | 0.001 | 33.332 | 33.532 |
| 87.33730011156564 | -2.508 | -0.005 | 33.368 | 33.545 |
| 87.504648568241 | -2.516 | -0.217 | 33.482 | 33.653 |
| 87.67199702491634 | -2.538 | -0.435 | 33.644 | 33.81 |
| 87.83004834510972 | -2.557 | -0.64 | 33.893 | 34.061 |
| 87.99739680178506 | -2.575 | -0.757 | 34.279 | 34.452 |
| 88.1647452584604 | -2.654 | -1.026 | 34.728 | 34.914 |
| 88.33209371513574 | -2.729 | -1.42 | 35.156 | 35.362 |
| 88.49944217181108 | -2.761 | -1.697 | 35.701 | 35.926 |
| 88.66679062848644 | -2.761 | -1.866 | 36.417 | 36.651 |
| 88.83413908516178 | -2.797 | -2.21 | 37.119 | 37.371 |
| 89.00148754183712 | -2.779 | -2.63 | 37.714 | 37.984 |
| 89.16883599851246 | -2.761 | -2.912 | 38.405 | 38.686 |
| 89.33618445518782 | -2.721 | -3.231 | 39.386 | 39.68 |
| 89.50353291186315 | -2.668 | -3.582 | 40.488 | 40.795 |
| 89.6708813685385 | -2.609 | -3.918 | 41.569 | 41.888 |
| 89.83822982521386 | -2.411 | -3.944 | 42.285 | 42.582 |
| 90.00557828188919 | -2.242 | -3.94 | 42.848 | 43.123 |
| 90.16362960208257 | -2.059 | -3.846 | 43.21 | 43.462 |
| 90.3309780587579 | -1.839 | -3.69 | 43.564 | 43.79 |
| 90.49832651543326 | -1.572 | -3.521 | 43.975 | 44.177 |
| 90.66567497210859 | -1.377 | -3.412 | 44.309 | 44.494 |
| 90.83302342878395 | -1.196 | -3.278 | 44.444 | 44.615 |
| 91.00037188545929 | -1.005 | -3.084 | 44.389 | 44.547 |
| 91.16772034213463 | -0.848 | -2.912 | 44.338 | 44.486 |
| 91.33506879880998 | -0.676 | -2.761 | 44.224 | 44.364 |
| 91.50241725548533 | -0.483 | -2.58 | 44.043 | 44.171 |
| 91.66976571216065 | -0.304 | -2.401 | 43.727 | 43.849 |
| 91.83711416883601 | -0.061 | -2.132 | 43.215 | 43.329 |
| 92.00446262551137 | 0.229 | -1.776 | 42.62 | 42.732 |
| 92.1718110821867 | 0.465 | -1.411 | 41.984 | 42.093 |
| 92.33915953886203 | 0.646 | -1.122 | 41.4 | 41.506 |
| 92.49721085905541 | 0.782 | -0.912 | 40.84 | 40.944 |
| 92.66455931573077 | 0.927 | -0.681 | 40.142 | 40.25 |
| 92.83190777240611 | 1.085 | -0.427 | 39.355 | 39.47 |
| 92.99925622908145 | 1.223 | -0.164 | 38.411 | 38.541 |
| 93.1666046857568 | 1.352 | 0.102 | 37.412 | 37.558 |
| 93.33395314243214 | 1.462 | 0.341 | 36.504 | 36.664 |
| 93.50130159910749 | 1.534 | 0.546 | 35.681 | 35.853 |
| 93.66865005578283 | 1.597 | 0.789 | 34.722 | 34.908 |
| 93.83599851245818 | 1.597 | 0.984 | 33.809 | 33.994 |
| 94.00334696913353 | 1.38 | 0.933 | 33.19 | 33.348 |
| 94.17069542580886 | 1.324 | 1.014 | 32.54 | 32.686 |
| 94.3380438824842 | 1.405 | 1.223 | 31.792 | 31.935 |
| 94.50539233915954 | 1.445 | 1.409 | 31.109 | 31.25 |
| 94.66344365935292 | 1.548 | 1.65 | 30.408 | 30.555 |
| 94.83079211602828 | 1.589 | 1.854 | 29.818 | 29.977 |
| 94.99814057270362 | 1.642 | 2.055 | 29.222 | 29.398 |
| 95.16548902937897 | 1.67 | 2.215 | 28.648 | 28.842 |
| 95.33283748605432 | 1.691 | 2.369 | 28.088 | 28.3 |
| 95.50018594272963 | 1.668 | 2.493 | 27.61 | 27.847 |
| 95.66753439940499 | 1.64 | 2.617 | 27.146 | 27.405 |
| 95.83488285608034 | 1.536 | 2.742 | 26.848 | 27.123 |
| 96.00223131275567 | 1.46 | 2.879 | 26.547 | 26.843 |
| 96.16957976943102 | 1.411 | 3.039 | 26.242 | 26.569 |
| 96.33692822610638 | 1.415 | 3.26 | 26.001 | 26.392 |
| 96.50427668278171 | 1.432 | 3.497 | 25.795 | 26.254 |
| 96.67162513945706 | 1.454 | 3.732 | 25.679 | 26.198 |
| 96.8389735961324 | 1.464 | 3.934 | 25.625 | 26.184 |
| 96.99702491632577 | 1.411 | 4.032 | 25.706 | 26.28 |
| 97.16437337300111 | 1.325 | 4.079 | 25.874 | 26.458 |
| 97.33172182967647 | 1.265 | 4.097 | 26.085 | 26.676 |
| 97.49907028635181 | 1.203 | 4.115 | 26.297 | 26.895 |
| 97.66641874302715 | 1.204 | 4.277 | 26.56 | 27.19 |
| 97.8337671997025 | 1.261 | 4.506 | 26.908 | 27.581 |
| 98.00111565637785 | 1.328 | 4.768 | 27.34 | 28.059 |
| 98.16846411305319 | 1.391 | 4.984 | 27.856 | 28.617 |
| 98.33581256972855 | 1.452 | 5.319 | 28.571 | 29.401 |
| 98.50316102640389 | 1.536 | 5.688 | 29.254 | 30.168 |
| 98.67050948307921 | 1.618 | 6.074 | 30.018 | 31.019 |
| 98.83785793975456 | 1.571 | 6.392 | 31.214 | 32.236 |
| 99.0052063964299 | 1.519 | 6.701 | 32.56 | 33.603 |
| 99.17255485310525 | 1.475 | 6.961 | 33.57 | 34.623 |
| 99.33060617329863 | 1.42 | 7.207 | 34.565 | 35.622 |
| 99.49795462997399 | 1.167 | 7.194 | 36.153 | 37.152 |
| 99.66530308664933 | 0.906 | 7.163 | 37.785 | 38.734 |
| 99.83265154332467 | 0.664 | 7.147 | 39.398 | 40.312 |
| 100.0 | 0.421 | 7.13 | 41.011 | 41.891 |